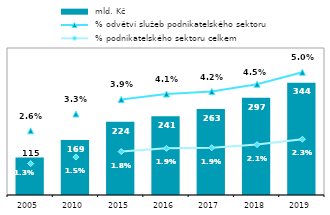
| Category |  mld. Kč |
|---|---|
| 2005.0 | 114.905 |
| 2010.0 | 168.518 |
| 2015.0 | 224.002 |
| 2016.0 | 241.04 |
| 2017.0 | 263.002 |
| 2018.0 | 297.334 |
| 2019.0 | 343.519 |